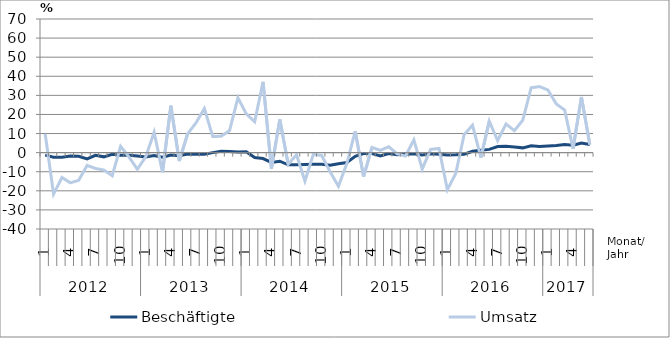
| Category | Beschäftigte | Umsatz |
|---|---|---|
| 0 | -1.3 | 9.8 |
| 1 | -2.4 | -21.7 |
| 2 | -2.4 | -13 |
| 3 | -1.8 | -15.8 |
| 4 | -1.9 | -14.5 |
| 5 | -3.3 | -6.7 |
| 6 | -1.4 | -8.3 |
| 7 | -2.2 | -9.1 |
| 8 | -0.9 | -12.1 |
| 9 | -1.4 | 3.3 |
| 10 | -1.4 | -2.3 |
| 11 | -1.8 | -8.7 |
| 12 | -2.3 | -2.2 |
| 13 | -1.5 | 10.7 |
| 14 | -2.4 | -10.3 |
| 15 | -1.3 | 24.6 |
| 16 | -1.6 | -4.4 |
| 17 | -0.7 | 9.9 |
| 18 | -0.8 | 15.6 |
| 19 | -0.8 | 23.1 |
| 20 | 0 | 8.4 |
| 21 | 0.7 | 8.6 |
| 22 | 0.6 | 11.5 |
| 23 | 0.3 | 28.7 |
| 24 | 0.5 | 20.3 |
| 25 | -2.6 | 16.2 |
| 26 | -3.1 | 37.1 |
| 27 | -5.1 | -8.5 |
| 28 | -4.5 | 17.4 |
| 29 | -6.4 | -6.1 |
| 30 | -6.4 | -1.1 |
| 31 | -6.2 | -14.9 |
| 32 | -6.1 | -0.9 |
| 33 | -6.1 | -1.5 |
| 34 | -6.6 | -10 |
| 35 | -5.8 | -17.6 |
| 36 | -5.2 | -5.7 |
| 37 | -1.9 | 11.2 |
| 38 | -0.5 | -12.5 |
| 39 | -0.5 | 2.7 |
| 40 | -1.7 | 1.2 |
| 41 | -0.5 | 3.1 |
| 42 | -1.1 | -0.6 |
| 43 | -0.8 | -1.8 |
| 44 | -0.6 | 6.7 |
| 45 | -1.2 | -8.6 |
| 46 | -0.6 | 1.7 |
| 47 | -0.9 | 2.2 |
| 48 | -1.3 | -19.4 |
| 49 | -1.1 | -10.9 |
| 50 | -0.8 | 9.4 |
| 51 | 0.7 | 14.4 |
| 52 | 1.2 | -2.6 |
| 53 | 1.7 | 16.5 |
| 54 | 3.2 | 6.3 |
| 55 | 3.4 | 15 |
| 56 | 3 | 11.5 |
| 57 | 2.5 | 17 |
| 58 | 3.6 | 34 |
| 59 | 3.2 | 34.6 |
| 60 | 3.5 | 32.8 |
| 61 | 3.8 | 25.5 |
| 62 | 4.2 | 22.3 |
| 63 | 3.9 | 2 |
| 64 | 5 | 29.1 |
| 65 | 4.3 | 4.3 |